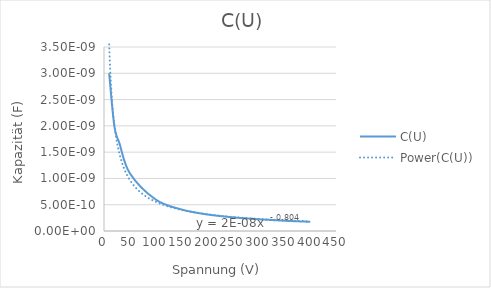
| Category | C(U) |
|---|---|
| 400.0 | 0 |
| 350.0 | 0 |
| 300.0 | 0 |
| 250.0 | 0 |
| 200.0 | 0 |
| 150.0 | 0 |
| 100.0 | 0 |
| 50.0 | 0 |
| 30.0 | 0 |
| 20.0 | 0 |
| 10.0 | 0 |